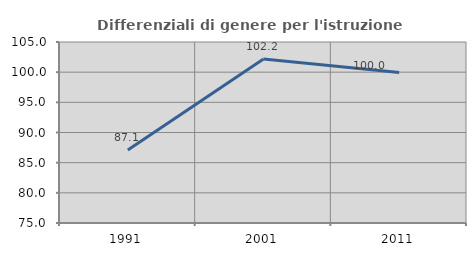
| Category | Differenziali di genere per l'istruzione superiore |
|---|---|
| 1991.0 | 87.1 |
| 2001.0 | 102.179 |
| 2011.0 | 99.959 |